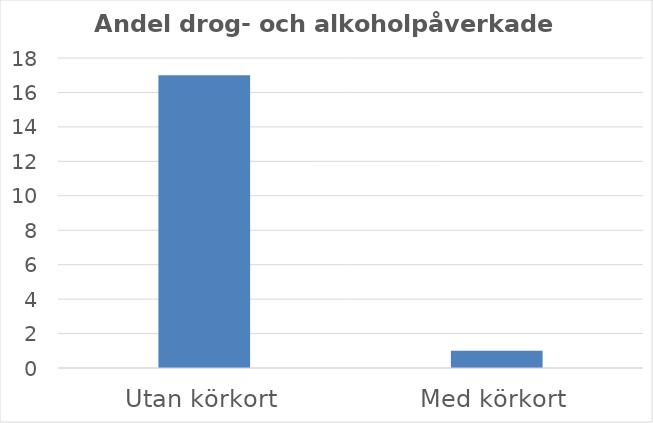
| Category | Andel % |
|---|---|
| Utan körkort | 17 |
| Med körkort | 1 |